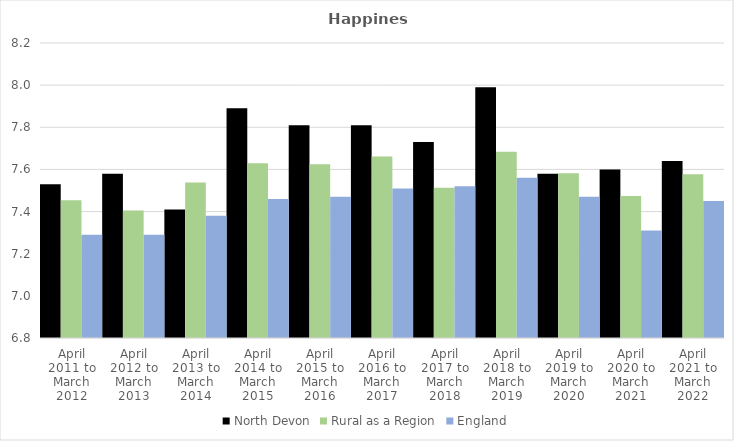
| Category | North Devon | Rural as a Region | England |
|---|---|---|---|
| April 2011 to March 2012 | 7.53 | 7.454 | 7.29 |
| April 2012 to March 2013 | 7.58 | 7.406 | 7.29 |
| April 2013 to March 2014 | 7.41 | 7.539 | 7.38 |
| April 2014 to March 2015 | 7.89 | 7.63 | 7.46 |
| April 2015 to March 2016 | 7.81 | 7.625 | 7.47 |
| April 2016 to March 2017 | 7.81 | 7.661 | 7.51 |
| April 2017 to March 2018 | 7.73 | 7.513 | 7.52 |
| April 2018 to March 2019 | 7.99 | 7.684 | 7.56 |
| April 2019 to March 2020 | 7.58 | 7.582 | 7.47 |
| April 2020 to March 2021 | 7.6 | 7.474 | 7.31 |
| April 2021 to March 2022 | 7.64 | 7.577 | 7.45 |